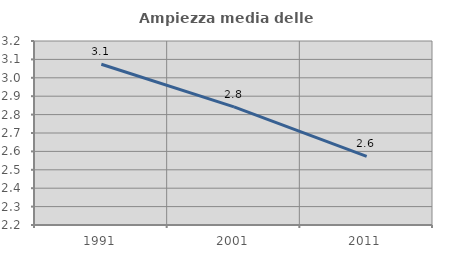
| Category | Ampiezza media delle famiglie |
|---|---|
| 1991.0 | 3.074 |
| 2001.0 | 2.842 |
| 2011.0 | 2.573 |